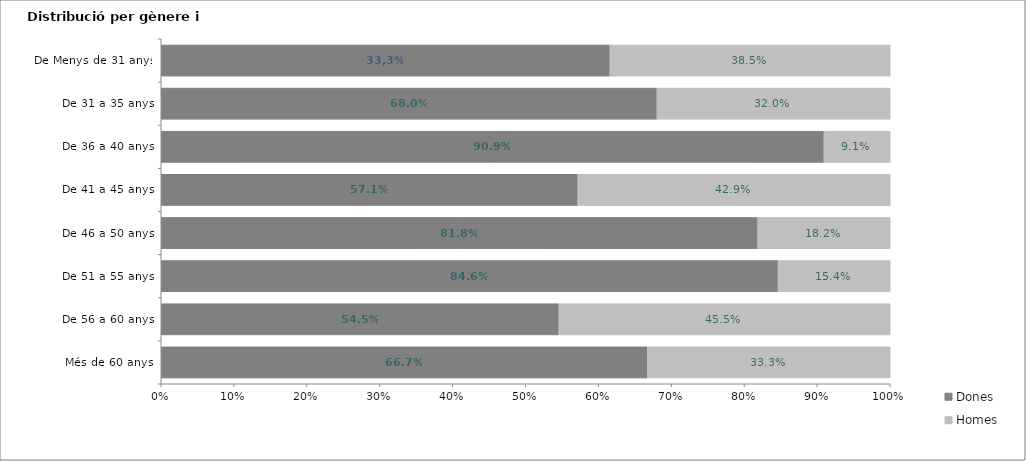
| Category | Dones | Homes |
|---|---|---|
| Més de 60 anys | 0.667 | 0.333 |
| De 56 a 60 anys | 0.545 | 0.455 |
| De 51 a 55 anys | 0.846 | 0.154 |
| De 46 a 50 anys | 0.818 | 0.182 |
| De 41 a 45 anys | 0.571 | 0.429 |
| De 36 a 40 anys | 0.909 | 0.091 |
| De 31 a 35 anys | 0.68 | 0.32 |
| De Menys de 31 anys | 0.615 | 0.385 |